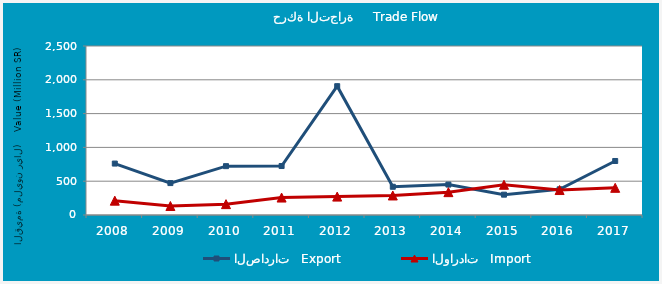
| Category | الصادرات   Export | الواردات   Import |
|---|---|---|
| 2008.0 | 760805704 | 212083932 |
| 2009.0 | 472103569 | 132931954 |
| 2010.0 | 722578304 | 160810446 |
| 2011.0 | 724399999 | 258127494 |
| 2012.0 | 1905732893 | 272074804 |
| 2013.0 | 417641931 | 288727436 |
| 2014.0 | 449869614 | 338146468 |
| 2015.0 | 300764519 | 447392071 |
| 2016.0 | 379541290 | 369224061 |
| 2017.0 | 798861257 | 402092898 |